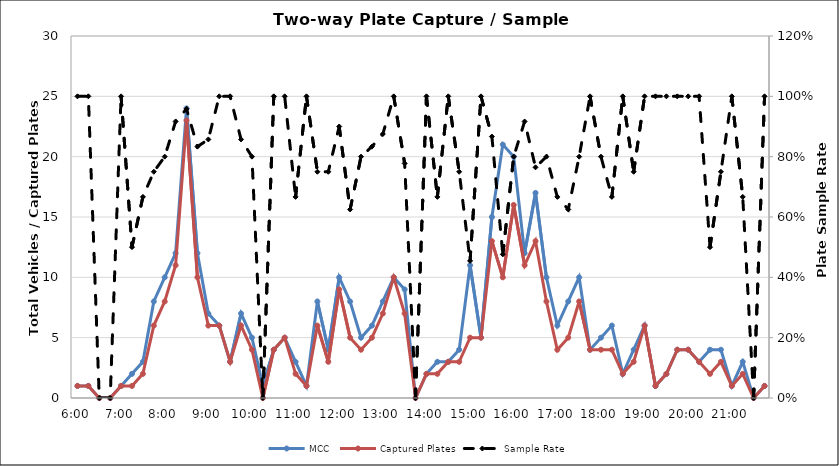
| Category | MCC | Captured Plates |
|---|---|---|
| 0.25 | 1 | 1 |
| 0.260416666666667 | 1 | 1 |
| 0.270833333333333 | 0 | 0 |
| 0.28125 | 0 | 0 |
| 0.291666666666667 | 1 | 1 |
| 0.302083333333333 | 2 | 1 |
| 0.3125 | 3 | 2 |
| 0.322916666666667 | 8 | 6 |
| 0.333333333333333 | 10 | 8 |
| 0.34375 | 12 | 11 |
| 0.354166666666667 | 24 | 23 |
| 0.364583333333333 | 12 | 10 |
| 0.375 | 7 | 6 |
| 0.385416666666667 | 6 | 6 |
| 0.395833333333333 | 3 | 3 |
| 0.40625 | 7 | 6 |
| 0.416666666666667 | 5 | 4 |
| 0.427083333333333 | 1 | 0 |
| 0.4375 | 4 | 4 |
| 0.447916666666667 | 5 | 5 |
| 0.458333333333333 | 3 | 2 |
| 0.46875 | 1 | 1 |
| 0.479166666666667 | 8 | 6 |
| 0.489583333333333 | 4 | 3 |
| 0.5 | 10 | 9 |
| 0.510416666666667 | 8 | 5 |
| 0.520833333333333 | 5 | 4 |
| 0.53125 | 6 | 5 |
| 0.541666666666667 | 8 | 7 |
| 0.552083333333333 | 10 | 10 |
| 0.5625 | 9 | 7 |
| 0.572916666666667 | 0 | 0 |
| 0.583333333333333 | 2 | 2 |
| 0.59375 | 3 | 2 |
| 0.604166666666667 | 3 | 3 |
| 0.614583333333333 | 4 | 3 |
| 0.625 | 11 | 5 |
| 0.635416666666667 | 5 | 5 |
| 0.645833333333333 | 15 | 13 |
| 0.65625 | 21 | 10 |
| 0.666666666666667 | 20 | 16 |
| 0.677083333333333 | 12 | 11 |
| 0.6875 | 17 | 13 |
| 0.697916666666667 | 10 | 8 |
| 0.708333333333333 | 6 | 4 |
| 0.71875 | 8 | 5 |
| 0.729166666666667 | 10 | 8 |
| 0.739583333333333 | 4 | 4 |
| 0.75 | 5 | 4 |
| 0.760416666666667 | 6 | 4 |
| 0.770833333333333 | 2 | 2 |
| 0.78125 | 4 | 3 |
| 0.791666666666667 | 6 | 6 |
| 0.802083333333333 | 1 | 1 |
| 0.8125 | 2 | 2 |
| 0.822916666666667 | 4 | 4 |
| 0.833333333333333 | 4 | 4 |
| 0.84375 | 3 | 3 |
| 0.854166666666667 | 4 | 2 |
| 0.864583333333333 | 4 | 3 |
| 0.875 | 1 | 1 |
| 0.885416666666667 | 3 | 2 |
| 0.895833333333333 | 0 | 0 |
| 0.90625 | 1 | 1 |